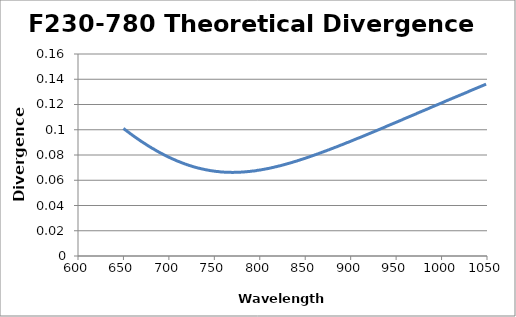
| Category | Divergence (deg) |
|---|---|
| 650.0 | 0.101 |
| 651.0 | 0.1 |
| 652.0 | 0.1 |
| 653.0 | 0.099 |
| 654.0 | 0.099 |
| 655.0 | 0.098 |
| 656.0 | 0.098 |
| 657.0 | 0.097 |
| 658.0 | 0.097 |
| 659.0 | 0.096 |
| 660.0 | 0.096 |
| 661.0 | 0.095 |
| 662.0 | 0.095 |
| 663.0 | 0.094 |
| 664.0 | 0.094 |
| 665.0 | 0.093 |
| 666.0 | 0.093 |
| 667.0 | 0.092 |
| 668.0 | 0.092 |
| 669.0 | 0.091 |
| 670.0 | 0.091 |
| 671.0 | 0.09 |
| 672.0 | 0.09 |
| 673.0 | 0.089 |
| 674.0 | 0.089 |
| 675.0 | 0.088 |
| 676.0 | 0.088 |
| 677.0 | 0.087 |
| 678.0 | 0.087 |
| 679.0 | 0.086 |
| 680.0 | 0.086 |
| 681.0 | 0.086 |
| 682.0 | 0.085 |
| 683.0 | 0.085 |
| 684.0 | 0.084 |
| 685.0 | 0.084 |
| 686.0 | 0.084 |
| 687.0 | 0.083 |
| 688.0 | 0.083 |
| 689.0 | 0.082 |
| 690.0 | 0.082 |
| 691.0 | 0.082 |
| 692.0 | 0.081 |
| 693.0 | 0.081 |
| 694.0 | 0.08 |
| 695.0 | 0.08 |
| 696.0 | 0.08 |
| 697.0 | 0.079 |
| 698.0 | 0.079 |
| 699.0 | 0.079 |
| 700.0 | 0.078 |
| 701.0 | 0.078 |
| 702.0 | 0.078 |
| 703.0 | 0.077 |
| 704.0 | 0.077 |
| 705.0 | 0.077 |
| 706.0 | 0.076 |
| 707.0 | 0.076 |
| 708.0 | 0.076 |
| 709.0 | 0.075 |
| 710.0 | 0.075 |
| 711.0 | 0.075 |
| 712.0 | 0.074 |
| 713.0 | 0.074 |
| 714.0 | 0.074 |
| 715.0 | 0.074 |
| 716.0 | 0.073 |
| 717.0 | 0.073 |
| 718.0 | 0.073 |
| 719.0 | 0.073 |
| 720.0 | 0.072 |
| 721.0 | 0.072 |
| 722.0 | 0.072 |
| 723.0 | 0.072 |
| 724.0 | 0.071 |
| 725.0 | 0.071 |
| 726.0 | 0.071 |
| 727.0 | 0.071 |
| 728.0 | 0.07 |
| 729.0 | 0.07 |
| 730.0 | 0.07 |
| 731.0 | 0.07 |
| 732.0 | 0.07 |
| 733.0 | 0.07 |
| 734.0 | 0.069 |
| 735.0 | 0.069 |
| 736.0 | 0.069 |
| 737.0 | 0.069 |
| 738.0 | 0.069 |
| 739.0 | 0.069 |
| 740.0 | 0.068 |
| 741.0 | 0.068 |
| 742.0 | 0.068 |
| 743.0 | 0.068 |
| 744.0 | 0.068 |
| 745.0 | 0.068 |
| 746.0 | 0.068 |
| 747.0 | 0.068 |
| 748.0 | 0.067 |
| 749.0 | 0.067 |
| 750.0 | 0.067 |
| 751.0 | 0.067 |
| 752.0 | 0.067 |
| 753.0 | 0.067 |
| 754.0 | 0.067 |
| 755.0 | 0.067 |
| 756.0 | 0.067 |
| 757.0 | 0.067 |
| 758.0 | 0.067 |
| 759.0 | 0.066 |
| 760.0 | 0.066 |
| 761.0 | 0.066 |
| 762.0 | 0.066 |
| 763.0 | 0.066 |
| 764.0 | 0.066 |
| 765.0 | 0.066 |
| 766.0 | 0.066 |
| 767.0 | 0.066 |
| 768.0 | 0.066 |
| 769.0 | 0.066 |
| 770.0 | 0.066 |
| 771.0 | 0.066 |
| 772.0 | 0.066 |
| 773.0 | 0.066 |
| 774.0 | 0.066 |
| 775.0 | 0.066 |
| 776.0 | 0.066 |
| 777.0 | 0.066 |
| 778.0 | 0.066 |
| 779.0 | 0.066 |
| 780.0 | 0.066 |
| 781.0 | 0.066 |
| 782.0 | 0.067 |
| 783.0 | 0.067 |
| 784.0 | 0.067 |
| 785.0 | 0.067 |
| 786.0 | 0.067 |
| 787.0 | 0.067 |
| 788.0 | 0.067 |
| 789.0 | 0.067 |
| 790.0 | 0.067 |
| 791.0 | 0.067 |
| 792.0 | 0.067 |
| 793.0 | 0.067 |
| 794.0 | 0.067 |
| 795.0 | 0.068 |
| 796.0 | 0.068 |
| 797.0 | 0.068 |
| 798.0 | 0.068 |
| 799.0 | 0.068 |
| 800.0 | 0.068 |
| 801.0 | 0.068 |
| 802.0 | 0.068 |
| 803.0 | 0.068 |
| 804.0 | 0.069 |
| 805.0 | 0.069 |
| 806.0 | 0.069 |
| 807.0 | 0.069 |
| 808.0 | 0.069 |
| 809.0 | 0.069 |
| 810.0 | 0.069 |
| 811.0 | 0.07 |
| 812.0 | 0.07 |
| 813.0 | 0.07 |
| 814.0 | 0.07 |
| 815.0 | 0.07 |
| 816.0 | 0.07 |
| 817.0 | 0.071 |
| 818.0 | 0.071 |
| 819.0 | 0.071 |
| 820.0 | 0.071 |
| 821.0 | 0.071 |
| 822.0 | 0.071 |
| 823.0 | 0.072 |
| 824.0 | 0.072 |
| 825.0 | 0.072 |
| 826.0 | 0.072 |
| 827.0 | 0.072 |
| 828.0 | 0.073 |
| 829.0 | 0.073 |
| 830.0 | 0.073 |
| 831.0 | 0.073 |
| 832.0 | 0.073 |
| 833.0 | 0.074 |
| 834.0 | 0.074 |
| 835.0 | 0.074 |
| 836.0 | 0.074 |
| 837.0 | 0.074 |
| 838.0 | 0.075 |
| 839.0 | 0.075 |
| 840.0 | 0.075 |
| 841.0 | 0.075 |
| 842.0 | 0.076 |
| 843.0 | 0.076 |
| 844.0 | 0.076 |
| 845.0 | 0.076 |
| 846.0 | 0.076 |
| 847.0 | 0.077 |
| 848.0 | 0.077 |
| 849.0 | 0.077 |
| 850.0 | 0.077 |
| 851.0 | 0.078 |
| 852.0 | 0.078 |
| 853.0 | 0.078 |
| 854.0 | 0.078 |
| 855.0 | 0.079 |
| 856.0 | 0.079 |
| 857.0 | 0.079 |
| 858.0 | 0.079 |
| 859.0 | 0.08 |
| 860.0 | 0.08 |
| 861.0 | 0.08 |
| 862.0 | 0.08 |
| 863.0 | 0.081 |
| 864.0 | 0.081 |
| 865.0 | 0.081 |
| 866.0 | 0.082 |
| 867.0 | 0.082 |
| 868.0 | 0.082 |
| 869.0 | 0.082 |
| 870.0 | 0.082 |
| 871.0 | 0.083 |
| 872.0 | 0.083 |
| 873.0 | 0.083 |
| 874.0 | 0.084 |
| 875.0 | 0.084 |
| 876.0 | 0.084 |
| 877.0 | 0.084 |
| 878.0 | 0.085 |
| 879.0 | 0.085 |
| 880.0 | 0.085 |
| 881.0 | 0.086 |
| 882.0 | 0.086 |
| 883.0 | 0.086 |
| 884.0 | 0.086 |
| 885.0 | 0.087 |
| 886.0 | 0.087 |
| 887.0 | 0.087 |
| 888.0 | 0.088 |
| 889.0 | 0.088 |
| 890.0 | 0.088 |
| 891.0 | 0.088 |
| 892.0 | 0.089 |
| 893.0 | 0.089 |
| 894.0 | 0.089 |
| 895.0 | 0.09 |
| 896.0 | 0.09 |
| 897.0 | 0.09 |
| 898.0 | 0.09 |
| 899.0 | 0.091 |
| 900.0 | 0.091 |
| 901.0 | 0.091 |
| 902.0 | 0.092 |
| 903.0 | 0.092 |
| 904.0 | 0.092 |
| 905.0 | 0.092 |
| 906.0 | 0.093 |
| 907.0 | 0.093 |
| 908.0 | 0.093 |
| 909.0 | 0.094 |
| 910.0 | 0.094 |
| 911.0 | 0.094 |
| 912.0 | 0.094 |
| 913.0 | 0.095 |
| 914.0 | 0.095 |
| 915.0 | 0.095 |
| 916.0 | 0.096 |
| 917.0 | 0.096 |
| 918.0 | 0.096 |
| 919.0 | 0.096 |
| 920.0 | 0.097 |
| 921.0 | 0.097 |
| 922.0 | 0.097 |
| 923.0 | 0.098 |
| 924.0 | 0.098 |
| 925.0 | 0.098 |
| 926.0 | 0.099 |
| 927.0 | 0.099 |
| 928.0 | 0.099 |
| 929.0 | 0.1 |
| 930.0 | 0.1 |
| 931.0 | 0.1 |
| 932.0 | 0.1 |
| 933.0 | 0.101 |
| 934.0 | 0.101 |
| 935.0 | 0.101 |
| 936.0 | 0.102 |
| 937.0 | 0.102 |
| 938.0 | 0.102 |
| 939.0 | 0.103 |
| 940.0 | 0.103 |
| 941.0 | 0.103 |
| 942.0 | 0.104 |
| 943.0 | 0.104 |
| 944.0 | 0.104 |
| 945.0 | 0.104 |
| 946.0 | 0.105 |
| 947.0 | 0.105 |
| 948.0 | 0.105 |
| 949.0 | 0.106 |
| 950.0 | 0.106 |
| 951.0 | 0.106 |
| 952.0 | 0.106 |
| 953.0 | 0.107 |
| 954.0 | 0.107 |
| 955.0 | 0.107 |
| 956.0 | 0.108 |
| 957.0 | 0.108 |
| 958.0 | 0.108 |
| 959.0 | 0.109 |
| 960.0 | 0.109 |
| 961.0 | 0.109 |
| 962.0 | 0.11 |
| 963.0 | 0.11 |
| 964.0 | 0.11 |
| 965.0 | 0.11 |
| 966.0 | 0.111 |
| 967.0 | 0.111 |
| 968.0 | 0.111 |
| 969.0 | 0.112 |
| 970.0 | 0.112 |
| 971.0 | 0.112 |
| 972.0 | 0.113 |
| 973.0 | 0.113 |
| 974.0 | 0.113 |
| 975.0 | 0.114 |
| 976.0 | 0.114 |
| 977.0 | 0.114 |
| 978.0 | 0.114 |
| 979.0 | 0.115 |
| 980.0 | 0.115 |
| 981.0 | 0.115 |
| 982.0 | 0.116 |
| 983.0 | 0.116 |
| 984.0 | 0.116 |
| 985.0 | 0.117 |
| 986.0 | 0.117 |
| 987.0 | 0.117 |
| 988.0 | 0.118 |
| 989.0 | 0.118 |
| 990.0 | 0.118 |
| 991.0 | 0.118 |
| 992.0 | 0.119 |
| 993.0 | 0.119 |
| 994.0 | 0.119 |
| 995.0 | 0.12 |
| 996.0 | 0.12 |
| 997.0 | 0.12 |
| 998.0 | 0.121 |
| 999.0 | 0.121 |
| 1000.0 | 0.121 |
| 1001.0 | 0.122 |
| 1002.0 | 0.122 |
| 1003.0 | 0.122 |
| 1004.0 | 0.122 |
| 1005.0 | 0.123 |
| 1006.0 | 0.123 |
| 1007.0 | 0.123 |
| 1008.0 | 0.124 |
| 1009.0 | 0.124 |
| 1010.0 | 0.124 |
| 1011.0 | 0.125 |
| 1012.0 | 0.125 |
| 1013.0 | 0.125 |
| 1014.0 | 0.126 |
| 1015.0 | 0.126 |
| 1016.0 | 0.126 |
| 1017.0 | 0.126 |
| 1018.0 | 0.127 |
| 1019.0 | 0.127 |
| 1020.0 | 0.127 |
| 1021.0 | 0.128 |
| 1022.0 | 0.128 |
| 1023.0 | 0.128 |
| 1024.0 | 0.128 |
| 1025.0 | 0.129 |
| 1026.0 | 0.129 |
| 1027.0 | 0.129 |
| 1028.0 | 0.13 |
| 1029.0 | 0.13 |
| 1030.0 | 0.13 |
| 1031.0 | 0.131 |
| 1032.0 | 0.131 |
| 1033.0 | 0.131 |
| 1034.0 | 0.132 |
| 1035.0 | 0.132 |
| 1036.0 | 0.132 |
| 1037.0 | 0.132 |
| 1038.0 | 0.133 |
| 1039.0 | 0.133 |
| 1040.0 | 0.133 |
| 1041.0 | 0.134 |
| 1042.0 | 0.134 |
| 1043.0 | 0.134 |
| 1044.0 | 0.135 |
| 1045.0 | 0.135 |
| 1046.0 | 0.135 |
| 1047.0 | 0.136 |
| 1048.0 | 0.136 |
| 1049.0 | 0.136 |